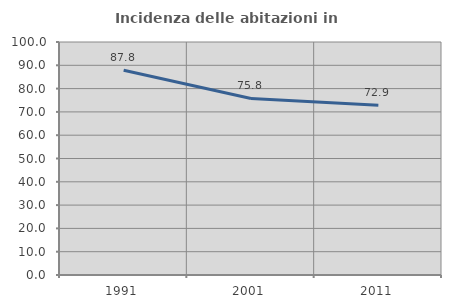
| Category | Incidenza delle abitazioni in proprietà  |
|---|---|
| 1991.0 | 87.838 |
| 2001.0 | 75.758 |
| 2011.0 | 72.881 |